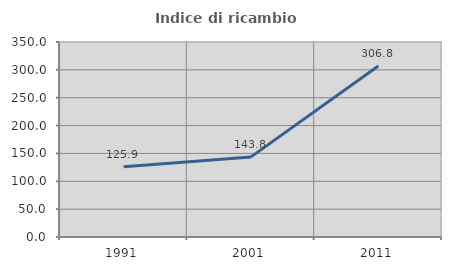
| Category | Indice di ricambio occupazionale  |
|---|---|
| 1991.0 | 125.917 |
| 2001.0 | 143.799 |
| 2011.0 | 306.849 |